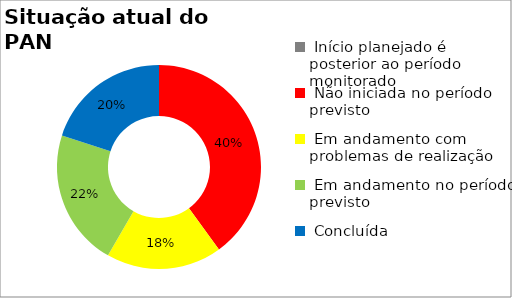
| Category | Series 0 |
|---|---|
|  Início planejado é posterior ao período monitorado | 0 |
|  Não iniciada no período previsto | 0.4 |
|  Em andamento com problemas de realização | 0.183 |
|  Em andamento no período previsto  | 0.217 |
|  Concluída | 0.2 |